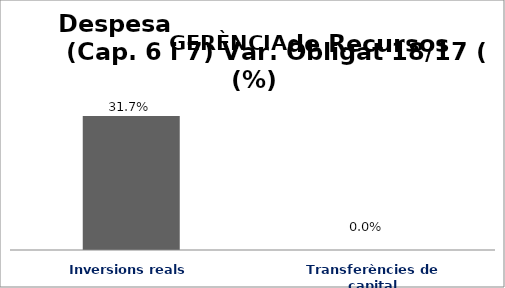
| Category | Series 0 |
|---|---|
| Inversions reals | 0.317 |
| Transferències de capital | 0 |